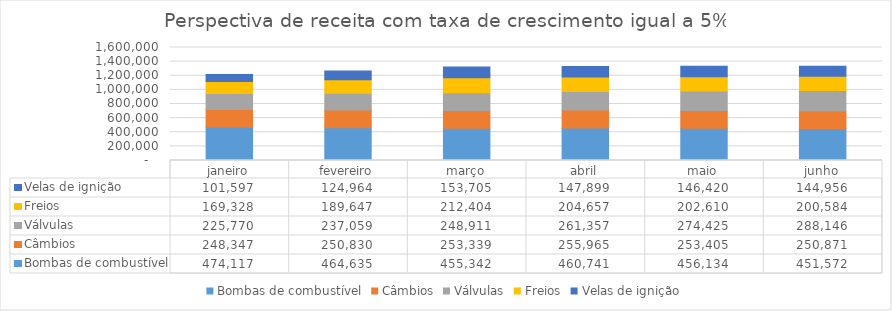
| Category | Bombas de combustível | Câmbios | Válvulas | Freios | Velas de ignição |
|---|---|---|---|---|---|
| janeiro | 474117 | 248347 | 225770 | 169327.5 | 101596.5 |
| fevereiro | 464634.66 | 250830.47 | 237058.5 | 189646.8 | 124963.695 |
| março | 455341.967 | 253338.775 | 248911.425 | 212404.416 | 153705.345 |
| abril | 460741 | 255965 | 261356.996 | 204657 | 147899 |
| maio | 456133.59 | 253405.35 | 274424.846 | 202610.43 | 146420.01 |
| junho | 451572.254 | 250871.296 | 288146.088 | 200584.326 | 144955.81 |